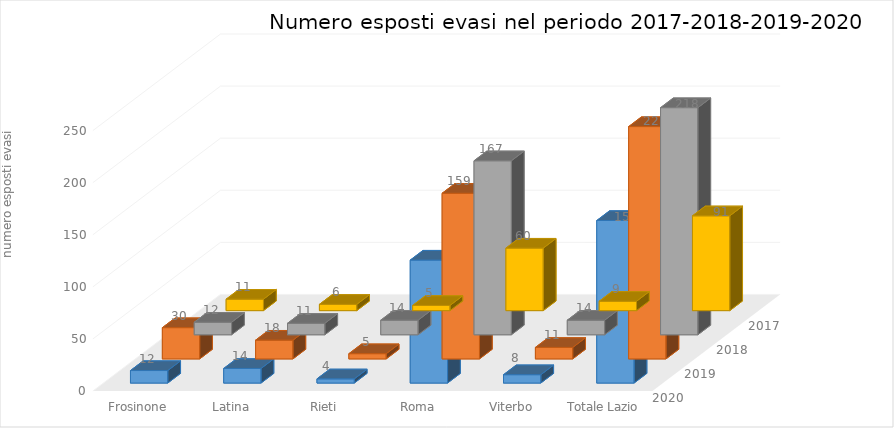
| Category | 2020 | 2019 | 2018 | 2017 |
|---|---|---|---|---|
| Frosinone | 11 | 12 | 30 | 12 |
| Latina | 6 | 11 | 18 | 14 |
| Rieti | 5 | 14 | 5 | 4 |
| Roma | 60 | 167 | 159 | 118 |
| Viterbo | 9 | 14 | 11 | 8 |
| Totale Lazio | 91 | 218 | 223 | 156 |